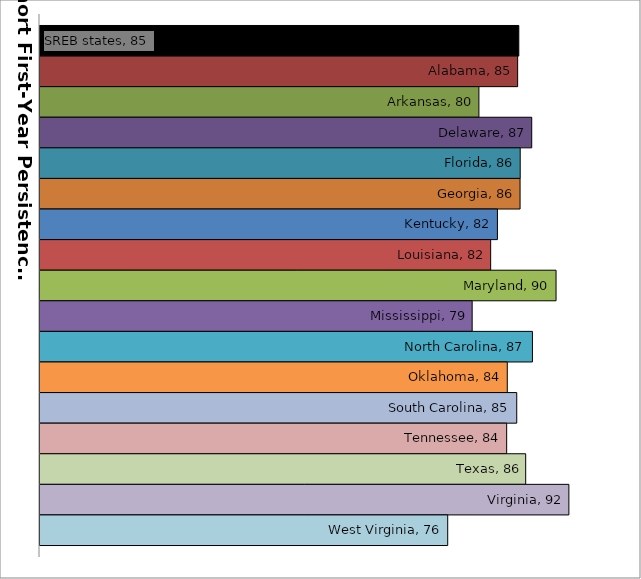
| Category | SREB states | Alabama | Arkansas | Delaware | Florida | Georgia | Kentucky | Louisiana | Maryland | Mississippi | North Carolina | Oklahoma | South Carolina | Tennessee | Texas | Virginia | West Virginia |
|---|---|---|---|---|---|---|---|---|---|---|---|---|---|---|---|---|---|
| 0 | 85.365 | 85.208 | 79.92 | 87.13 | 85.558 | 85.538 | 82.449 | 81.523 | 90.452 | 78.998 | 87.228 | 83.793 | 85.084 | 83.708 | 86.308 | 92.203 | 75.66 |